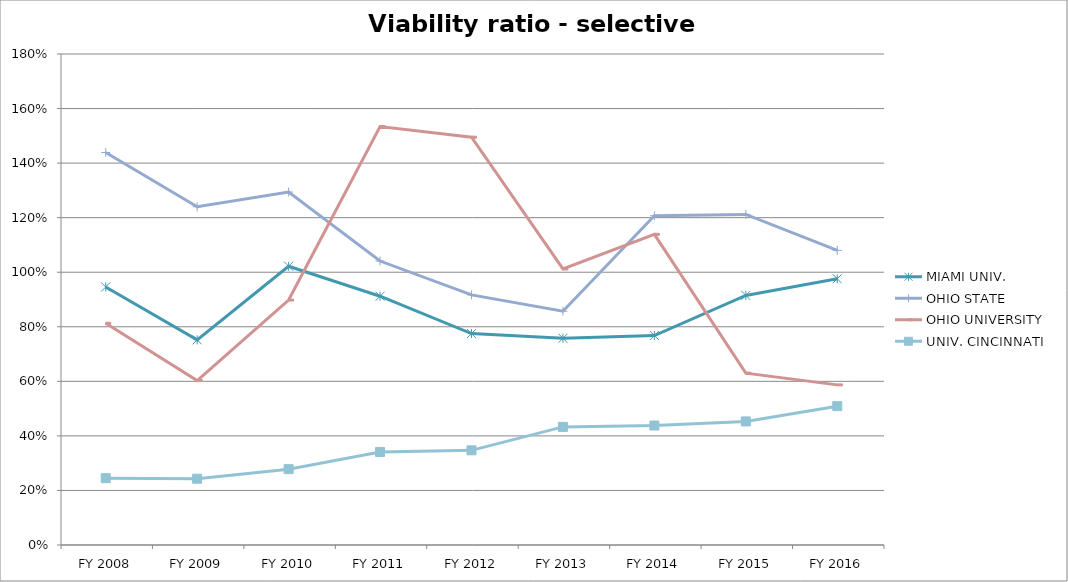
| Category | MIAMI UNIV.  | OHIO STATE  | OHIO UNIVERSITY  | UNIV. CINCINNATI  |
|---|---|---|---|---|
| FY 2016 | 0.976 | 1.08 | 0.587 | 0.509 |
| FY 2015 | 0.915 | 1.212 | 0.63 | 0.453 |
| FY 2014 | 0.768 | 1.207 | 1.139 | 0.438 |
| FY 2013 | 0.758 | 0.857 | 1.012 | 0.433 |
| FY 2012 | 0.775 | 0.917 | 1.495 | 0.347 |
| FY 2011 | 0.912 | 1.041 | 1.534 | 0.341 |
| FY 2010 | 1.022 | 1.294 | 0.898 | 0.278 |
| FY 2009 | 0.752 | 1.24 | 0.603 | 0.243 |
| FY 2008 | 0.946 | 1.439 | 0.813 | 0.245 |